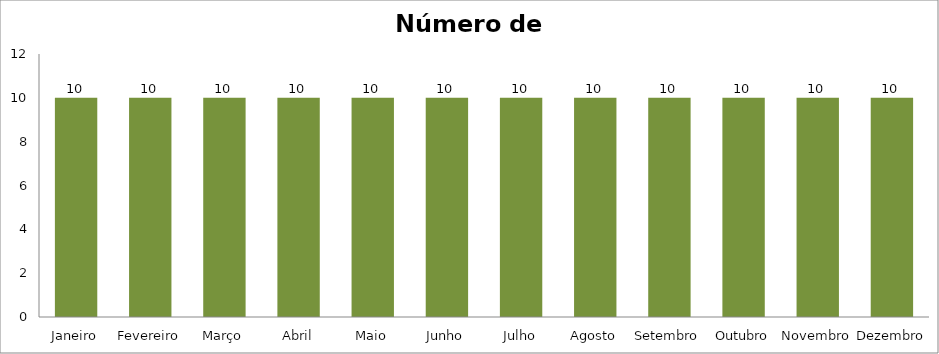
| Category | Número de Funcionários |
|---|---|
| Janeiro | 10 |
| Fevereiro | 10 |
| Março | 10 |
| Abril | 10 |
| Maio | 10 |
| Junho | 10 |
| Julho | 10 |
| Agosto | 10 |
| Setembro | 10 |
| Outubro | 10 |
| Novembro | 10 |
| Dezembro | 10 |